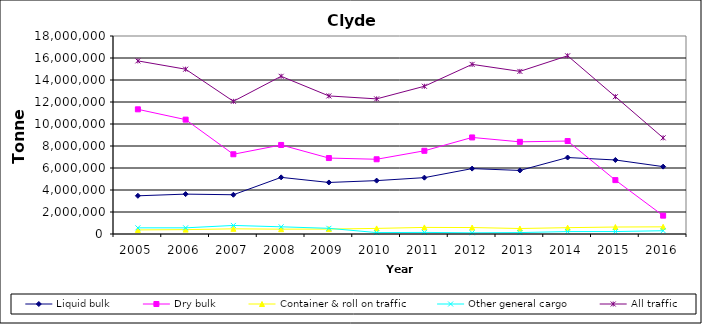
| Category | Liquid bulk | Dry bulk | Container & roll on traffic | Other general cargo | All traffic |
|---|---|---|---|---|---|
| 2005.0 | 3473000 | 11334000 | 370000 | 560000 | 15737000 |
| 2006.0 | 3626000 | 10397000 | 398000 | 560000 | 14981000 |
| 2007.0 | 3568000 | 7249000 | 469000 | 777000 | 12063000 |
| 2008.0 | 5149000 | 8095000 | 439000 | 654000 | 14338000 |
| 2009.0 | 4685485 | 6904211 | 446748 | 515680 | 12552124 |
| 2010.0 | 4853000 | 6793000 | 509000 | 128000 | 12283000 |
| 2011.0 | 5124000 | 7564000 | 599000 | 144000 | 13431000 |
| 2012.0 | 5945000 | 8778000 | 588000 | 109000 | 15421000 |
| 2013.0 | 5777000 | 8377000 | 499000 | 130000 | 14783000 |
| 2014.0 | 6952000 | 8451000 | 576000 | 221000 | 16201000 |
| 2015.0 | 6729000 | 4899000 | 634000 | 223000 | 12484000 |
| 2016.0 | 6125000 | 1668000 | 651000 | 298000 | 8742000 |